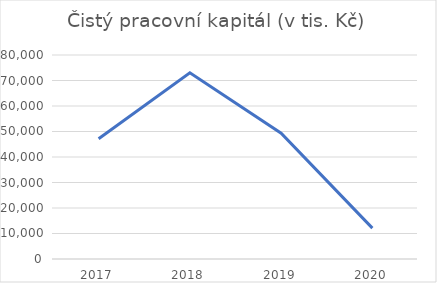
| Category | Čistý pracovní kapitál (v tis. Kč) |
|---|---|
| 2017.0 | 47161 |
| 2018.0 | 73001 |
| 2019.0 | 49362 |
| 2020.0 | 12100 |